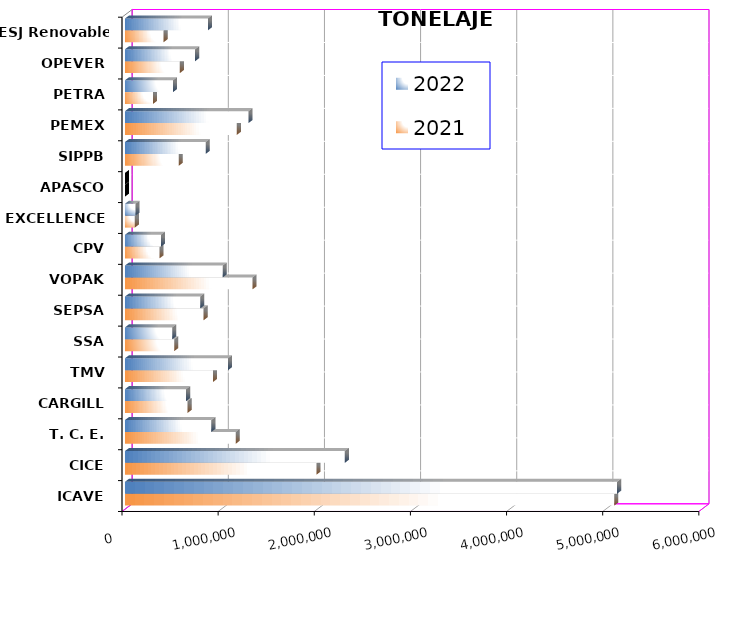
| Category | 2021 | 2022 |
|---|---|---|
| ICAVE | 5089363.632 | 5118582.021 |
| CICE | 1991929.947 | 2287131.518 |
| T. C. E. | 1151796.877 | 898374.983 |
| CARGILL | 651339.31 | 636020.551 |
| TMV | 915423.24 | 1072202.39 |
| SSA | 512768.704 | 491778.73 |
| SEPSA | 818126.1 | 783316.71 |
| VOPAK | 1326843.811 | 1015798.107 |
| CPV | 358129.563 | 374617.04 |
| EXCELLENCE | 102805.16 | 108674.337 |
| APASCO | 0 | 0 |
| SIPPB | 559930.541 | 840251.94 |
| PEMEX | 1163719.408 | 1285550.647 |
| PETRA | 290939.25 | 499652.41 |
| OPEVER | 570670.07 | 729377.392 |
| ESJ Renovable III | 402066.92 | 862595.844 |